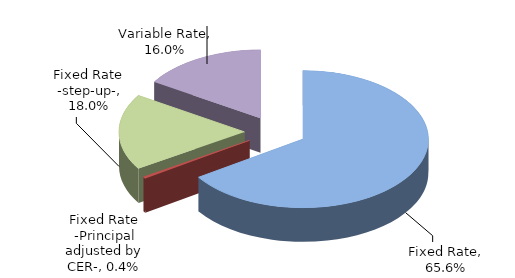
| Category | Series 0 |
|---|---|
| Fixed Rate | 0.656 |
| Fixed Rate -Principal adjusted by CER- | 0.004 |
| Fixed Rate -step-up- | 0.18 |
| Variable Rate | 0.16 |